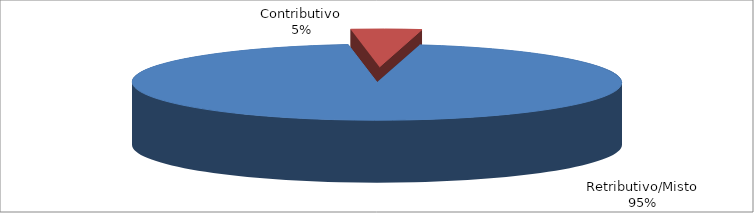
| Category | Series 1 |
|---|---|
| Retributivo/Misto | 141621 |
| Contributivo | 6923 |